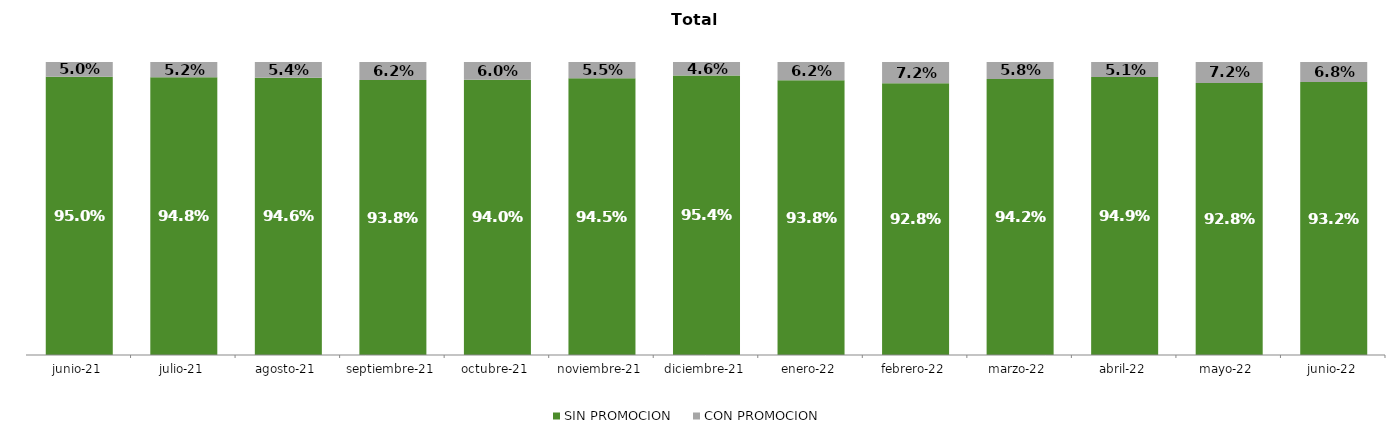
| Category | SIN PROMOCION   | CON PROMOCION   |
|---|---|---|
| 2021-06-01 | 0.95 | 0.05 |
| 2021-07-01 | 0.948 | 0.052 |
| 2021-08-01 | 0.946 | 0.054 |
| 2021-09-01 | 0.938 | 0.062 |
| 2021-10-01 | 0.94 | 0.06 |
| 2021-11-01 | 0.945 | 0.055 |
| 2021-12-01 | 0.954 | 0.046 |
| 2022-01-01 | 0.938 | 0.062 |
| 2022-02-01 | 0.928 | 0.072 |
| 2022-03-01 | 0.942 | 0.058 |
| 2022-04-01 | 0.949 | 0.051 |
| 2022-05-01 | 0.928 | 0.072 |
| 2022-06-01 | 0.932 | 0.068 |